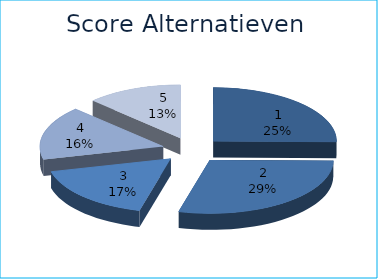
| Category | Series 0 |
|---|---|
| 0 | 25.185 |
| 1 | 28.889 |
| 2 | 17.037 |
| 3 | 16.296 |
| 4 | 12.593 |